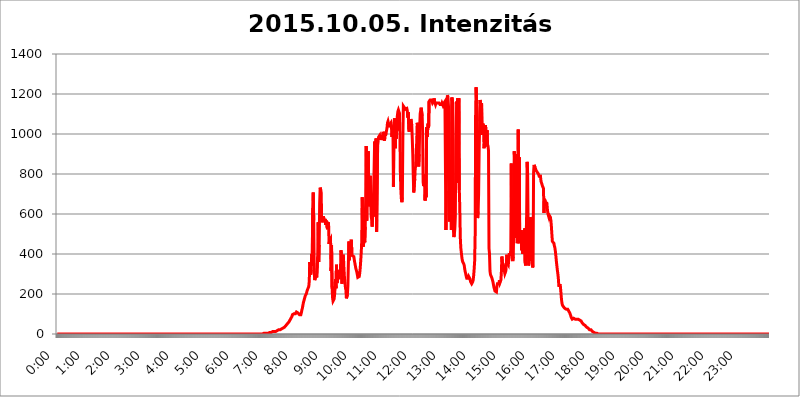
| Category | 2015.10.05. Intenzitás [W/m^2] |
|---|---|
| 0.0 | 0 |
| 0.0006944444444444445 | 0 |
| 0.001388888888888889 | 0 |
| 0.0020833333333333333 | 0 |
| 0.002777777777777778 | 0 |
| 0.003472222222222222 | 0 |
| 0.004166666666666667 | 0 |
| 0.004861111111111111 | 0 |
| 0.005555555555555556 | 0 |
| 0.0062499999999999995 | 0 |
| 0.006944444444444444 | 0 |
| 0.007638888888888889 | 0 |
| 0.008333333333333333 | 0 |
| 0.009027777777777779 | 0 |
| 0.009722222222222222 | 0 |
| 0.010416666666666666 | 0 |
| 0.011111111111111112 | 0 |
| 0.011805555555555555 | 0 |
| 0.012499999999999999 | 0 |
| 0.013194444444444444 | 0 |
| 0.013888888888888888 | 0 |
| 0.014583333333333332 | 0 |
| 0.015277777777777777 | 0 |
| 0.015972222222222224 | 0 |
| 0.016666666666666666 | 0 |
| 0.017361111111111112 | 0 |
| 0.018055555555555557 | 0 |
| 0.01875 | 0 |
| 0.019444444444444445 | 0 |
| 0.02013888888888889 | 0 |
| 0.020833333333333332 | 0 |
| 0.02152777777777778 | 0 |
| 0.022222222222222223 | 0 |
| 0.02291666666666667 | 0 |
| 0.02361111111111111 | 0 |
| 0.024305555555555556 | 0 |
| 0.024999999999999998 | 0 |
| 0.025694444444444447 | 0 |
| 0.02638888888888889 | 0 |
| 0.027083333333333334 | 0 |
| 0.027777777777777776 | 0 |
| 0.02847222222222222 | 0 |
| 0.029166666666666664 | 0 |
| 0.029861111111111113 | 0 |
| 0.030555555555555555 | 0 |
| 0.03125 | 0 |
| 0.03194444444444445 | 0 |
| 0.03263888888888889 | 0 |
| 0.03333333333333333 | 0 |
| 0.034027777777777775 | 0 |
| 0.034722222222222224 | 0 |
| 0.035416666666666666 | 0 |
| 0.036111111111111115 | 0 |
| 0.03680555555555556 | 0 |
| 0.0375 | 0 |
| 0.03819444444444444 | 0 |
| 0.03888888888888889 | 0 |
| 0.03958333333333333 | 0 |
| 0.04027777777777778 | 0 |
| 0.04097222222222222 | 0 |
| 0.041666666666666664 | 0 |
| 0.042361111111111106 | 0 |
| 0.04305555555555556 | 0 |
| 0.043750000000000004 | 0 |
| 0.044444444444444446 | 0 |
| 0.04513888888888889 | 0 |
| 0.04583333333333334 | 0 |
| 0.04652777777777778 | 0 |
| 0.04722222222222222 | 0 |
| 0.04791666666666666 | 0 |
| 0.04861111111111111 | 0 |
| 0.049305555555555554 | 0 |
| 0.049999999999999996 | 0 |
| 0.05069444444444445 | 0 |
| 0.051388888888888894 | 0 |
| 0.052083333333333336 | 0 |
| 0.05277777777777778 | 0 |
| 0.05347222222222222 | 0 |
| 0.05416666666666667 | 0 |
| 0.05486111111111111 | 0 |
| 0.05555555555555555 | 0 |
| 0.05625 | 0 |
| 0.05694444444444444 | 0 |
| 0.057638888888888885 | 0 |
| 0.05833333333333333 | 0 |
| 0.05902777777777778 | 0 |
| 0.059722222222222225 | 0 |
| 0.06041666666666667 | 0 |
| 0.061111111111111116 | 0 |
| 0.06180555555555556 | 0 |
| 0.0625 | 0 |
| 0.06319444444444444 | 0 |
| 0.06388888888888888 | 0 |
| 0.06458333333333334 | 0 |
| 0.06527777777777778 | 0 |
| 0.06597222222222222 | 0 |
| 0.06666666666666667 | 0 |
| 0.06736111111111111 | 0 |
| 0.06805555555555555 | 0 |
| 0.06874999999999999 | 0 |
| 0.06944444444444443 | 0 |
| 0.07013888888888889 | 0 |
| 0.07083333333333333 | 0 |
| 0.07152777777777779 | 0 |
| 0.07222222222222223 | 0 |
| 0.07291666666666667 | 0 |
| 0.07361111111111111 | 0 |
| 0.07430555555555556 | 0 |
| 0.075 | 0 |
| 0.07569444444444444 | 0 |
| 0.0763888888888889 | 0 |
| 0.07708333333333334 | 0 |
| 0.07777777777777778 | 0 |
| 0.07847222222222222 | 0 |
| 0.07916666666666666 | 0 |
| 0.0798611111111111 | 0 |
| 0.08055555555555556 | 0 |
| 0.08125 | 0 |
| 0.08194444444444444 | 0 |
| 0.08263888888888889 | 0 |
| 0.08333333333333333 | 0 |
| 0.08402777777777777 | 0 |
| 0.08472222222222221 | 0 |
| 0.08541666666666665 | 0 |
| 0.08611111111111112 | 0 |
| 0.08680555555555557 | 0 |
| 0.08750000000000001 | 0 |
| 0.08819444444444445 | 0 |
| 0.08888888888888889 | 0 |
| 0.08958333333333333 | 0 |
| 0.09027777777777778 | 0 |
| 0.09097222222222222 | 0 |
| 0.09166666666666667 | 0 |
| 0.09236111111111112 | 0 |
| 0.09305555555555556 | 0 |
| 0.09375 | 0 |
| 0.09444444444444444 | 0 |
| 0.09513888888888888 | 0 |
| 0.09583333333333333 | 0 |
| 0.09652777777777777 | 0 |
| 0.09722222222222222 | 0 |
| 0.09791666666666667 | 0 |
| 0.09861111111111111 | 0 |
| 0.09930555555555555 | 0 |
| 0.09999999999999999 | 0 |
| 0.10069444444444443 | 0 |
| 0.1013888888888889 | 0 |
| 0.10208333333333335 | 0 |
| 0.10277777777777779 | 0 |
| 0.10347222222222223 | 0 |
| 0.10416666666666667 | 0 |
| 0.10486111111111111 | 0 |
| 0.10555555555555556 | 0 |
| 0.10625 | 0 |
| 0.10694444444444444 | 0 |
| 0.1076388888888889 | 0 |
| 0.10833333333333334 | 0 |
| 0.10902777777777778 | 0 |
| 0.10972222222222222 | 0 |
| 0.1111111111111111 | 0 |
| 0.11180555555555556 | 0 |
| 0.11180555555555556 | 0 |
| 0.1125 | 0 |
| 0.11319444444444444 | 0 |
| 0.11388888888888889 | 0 |
| 0.11458333333333333 | 0 |
| 0.11527777777777777 | 0 |
| 0.11597222222222221 | 0 |
| 0.11666666666666665 | 0 |
| 0.1173611111111111 | 0 |
| 0.11805555555555557 | 0 |
| 0.11944444444444445 | 0 |
| 0.12013888888888889 | 0 |
| 0.12083333333333333 | 0 |
| 0.12152777777777778 | 0 |
| 0.12222222222222223 | 0 |
| 0.12291666666666667 | 0 |
| 0.12291666666666667 | 0 |
| 0.12361111111111112 | 0 |
| 0.12430555555555556 | 0 |
| 0.125 | 0 |
| 0.12569444444444444 | 0 |
| 0.12638888888888888 | 0 |
| 0.12708333333333333 | 0 |
| 0.16875 | 0 |
| 0.12847222222222224 | 0 |
| 0.12916666666666668 | 0 |
| 0.12986111111111112 | 0 |
| 0.13055555555555556 | 0 |
| 0.13125 | 0 |
| 0.13194444444444445 | 0 |
| 0.1326388888888889 | 0 |
| 0.13333333333333333 | 0 |
| 0.13402777777777777 | 0 |
| 0.13402777777777777 | 0 |
| 0.13472222222222222 | 0 |
| 0.13541666666666666 | 0 |
| 0.1361111111111111 | 0 |
| 0.13749999999999998 | 0 |
| 0.13819444444444443 | 0 |
| 0.1388888888888889 | 0 |
| 0.13958333333333334 | 0 |
| 0.14027777777777778 | 0 |
| 0.14097222222222222 | 0 |
| 0.14166666666666666 | 0 |
| 0.1423611111111111 | 0 |
| 0.14305555555555557 | 0 |
| 0.14375000000000002 | 0 |
| 0.14444444444444446 | 0 |
| 0.1451388888888889 | 0 |
| 0.1451388888888889 | 0 |
| 0.14652777777777778 | 0 |
| 0.14722222222222223 | 0 |
| 0.14791666666666667 | 0 |
| 0.1486111111111111 | 0 |
| 0.14930555555555555 | 0 |
| 0.15 | 0 |
| 0.15069444444444444 | 0 |
| 0.15138888888888888 | 0 |
| 0.15208333333333332 | 0 |
| 0.15277777777777776 | 0 |
| 0.15347222222222223 | 0 |
| 0.15416666666666667 | 0 |
| 0.15486111111111112 | 0 |
| 0.15555555555555556 | 0 |
| 0.15625 | 0 |
| 0.15694444444444444 | 0 |
| 0.15763888888888888 | 0 |
| 0.15833333333333333 | 0 |
| 0.15902777777777777 | 0 |
| 0.15972222222222224 | 0 |
| 0.16041666666666668 | 0 |
| 0.16111111111111112 | 0 |
| 0.16180555555555556 | 0 |
| 0.1625 | 0 |
| 0.16319444444444445 | 0 |
| 0.1638888888888889 | 0 |
| 0.16458333333333333 | 0 |
| 0.16527777777777777 | 0 |
| 0.16597222222222222 | 0 |
| 0.16666666666666666 | 0 |
| 0.1673611111111111 | 0 |
| 0.16805555555555554 | 0 |
| 0.16874999999999998 | 0 |
| 0.16944444444444443 | 0 |
| 0.17013888888888887 | 0 |
| 0.1708333333333333 | 0 |
| 0.17152777777777775 | 0 |
| 0.17222222222222225 | 0 |
| 0.1729166666666667 | 0 |
| 0.17361111111111113 | 0 |
| 0.17430555555555557 | 0 |
| 0.17500000000000002 | 0 |
| 0.17569444444444446 | 0 |
| 0.1763888888888889 | 0 |
| 0.17708333333333334 | 0 |
| 0.17777777777777778 | 0 |
| 0.17847222222222223 | 0 |
| 0.17916666666666667 | 0 |
| 0.1798611111111111 | 0 |
| 0.18055555555555555 | 0 |
| 0.18125 | 0 |
| 0.18194444444444444 | 0 |
| 0.1826388888888889 | 0 |
| 0.18333333333333335 | 0 |
| 0.1840277777777778 | 0 |
| 0.18472222222222223 | 0 |
| 0.18541666666666667 | 0 |
| 0.18611111111111112 | 0 |
| 0.18680555555555556 | 0 |
| 0.1875 | 0 |
| 0.18819444444444444 | 0 |
| 0.18888888888888888 | 0 |
| 0.18958333333333333 | 0 |
| 0.19027777777777777 | 0 |
| 0.1909722222222222 | 0 |
| 0.19166666666666665 | 0 |
| 0.19236111111111112 | 0 |
| 0.19305555555555554 | 0 |
| 0.19375 | 0 |
| 0.19444444444444445 | 0 |
| 0.1951388888888889 | 0 |
| 0.19583333333333333 | 0 |
| 0.19652777777777777 | 0 |
| 0.19722222222222222 | 0 |
| 0.19791666666666666 | 0 |
| 0.1986111111111111 | 0 |
| 0.19930555555555554 | 0 |
| 0.19999999999999998 | 0 |
| 0.20069444444444443 | 0 |
| 0.20138888888888887 | 0 |
| 0.2020833333333333 | 0 |
| 0.2027777777777778 | 0 |
| 0.2034722222222222 | 0 |
| 0.2041666666666667 | 0 |
| 0.20486111111111113 | 0 |
| 0.20555555555555557 | 0 |
| 0.20625000000000002 | 0 |
| 0.20694444444444446 | 0 |
| 0.2076388888888889 | 0 |
| 0.20833333333333334 | 0 |
| 0.20902777777777778 | 0 |
| 0.20972222222222223 | 0 |
| 0.21041666666666667 | 0 |
| 0.2111111111111111 | 0 |
| 0.21180555555555555 | 0 |
| 0.2125 | 0 |
| 0.21319444444444444 | 0 |
| 0.2138888888888889 | 0 |
| 0.21458333333333335 | 0 |
| 0.2152777777777778 | 0 |
| 0.21597222222222223 | 0 |
| 0.21666666666666667 | 0 |
| 0.21736111111111112 | 0 |
| 0.21805555555555556 | 0 |
| 0.21875 | 0 |
| 0.21944444444444444 | 0 |
| 0.22013888888888888 | 0 |
| 0.22083333333333333 | 0 |
| 0.22152777777777777 | 0 |
| 0.2222222222222222 | 0 |
| 0.22291666666666665 | 0 |
| 0.2236111111111111 | 0 |
| 0.22430555555555556 | 0 |
| 0.225 | 0 |
| 0.22569444444444445 | 0 |
| 0.2263888888888889 | 0 |
| 0.22708333333333333 | 0 |
| 0.22777777777777777 | 0 |
| 0.22847222222222222 | 0 |
| 0.22916666666666666 | 0 |
| 0.2298611111111111 | 0 |
| 0.23055555555555554 | 0 |
| 0.23124999999999998 | 0 |
| 0.23194444444444443 | 0 |
| 0.23263888888888887 | 0 |
| 0.2333333333333333 | 0 |
| 0.2340277777777778 | 0 |
| 0.2347222222222222 | 0 |
| 0.2354166666666667 | 0 |
| 0.23611111111111113 | 0 |
| 0.23680555555555557 | 0 |
| 0.23750000000000002 | 0 |
| 0.23819444444444446 | 0 |
| 0.2388888888888889 | 0 |
| 0.23958333333333334 | 0 |
| 0.24027777777777778 | 0 |
| 0.24097222222222223 | 0 |
| 0.24166666666666667 | 0 |
| 0.2423611111111111 | 0 |
| 0.24305555555555555 | 0 |
| 0.24375 | 0 |
| 0.24444444444444446 | 0 |
| 0.24513888888888888 | 0 |
| 0.24583333333333335 | 0 |
| 0.2465277777777778 | 0 |
| 0.24722222222222223 | 0 |
| 0.24791666666666667 | 0 |
| 0.24861111111111112 | 0 |
| 0.24930555555555556 | 0 |
| 0.25 | 0 |
| 0.25069444444444444 | 0 |
| 0.2513888888888889 | 0 |
| 0.2520833333333333 | 0 |
| 0.25277777777777777 | 0 |
| 0.2534722222222222 | 0 |
| 0.25416666666666665 | 0 |
| 0.2548611111111111 | 0 |
| 0.2555555555555556 | 0 |
| 0.25625000000000003 | 0 |
| 0.2569444444444445 | 0 |
| 0.2576388888888889 | 0 |
| 0.25833333333333336 | 0 |
| 0.2590277777777778 | 0 |
| 0.25972222222222224 | 0 |
| 0.2604166666666667 | 0 |
| 0.2611111111111111 | 0 |
| 0.26180555555555557 | 0 |
| 0.2625 | 0 |
| 0.26319444444444445 | 0 |
| 0.2638888888888889 | 0 |
| 0.26458333333333334 | 0 |
| 0.2652777777777778 | 0 |
| 0.2659722222222222 | 0 |
| 0.26666666666666666 | 0 |
| 0.2673611111111111 | 0 |
| 0.26805555555555555 | 0 |
| 0.26875 | 0 |
| 0.26944444444444443 | 0 |
| 0.2701388888888889 | 0 |
| 0.2708333333333333 | 0 |
| 0.27152777777777776 | 0 |
| 0.2722222222222222 | 0 |
| 0.27291666666666664 | 0 |
| 0.2736111111111111 | 0 |
| 0.2743055555555555 | 0 |
| 0.27499999999999997 | 0 |
| 0.27569444444444446 | 0 |
| 0.27638888888888885 | 0 |
| 0.27708333333333335 | 0 |
| 0.2777777777777778 | 0 |
| 0.27847222222222223 | 0 |
| 0.2791666666666667 | 0 |
| 0.2798611111111111 | 0 |
| 0.28055555555555556 | 0 |
| 0.28125 | 0 |
| 0.28194444444444444 | 0 |
| 0.2826388888888889 | 0 |
| 0.2833333333333333 | 0 |
| 0.28402777777777777 | 0 |
| 0.2847222222222222 | 0 |
| 0.28541666666666665 | 0 |
| 0.28611111111111115 | 0 |
| 0.28680555555555554 | 0 |
| 0.28750000000000003 | 0 |
| 0.2881944444444445 | 0 |
| 0.2888888888888889 | 0 |
| 0.28958333333333336 | 3.525 |
| 0.2902777777777778 | 3.525 |
| 0.29097222222222224 | 3.525 |
| 0.2916666666666667 | 3.525 |
| 0.2923611111111111 | 3.525 |
| 0.29305555555555557 | 3.525 |
| 0.29375 | 3.525 |
| 0.29444444444444445 | 3.525 |
| 0.2951388888888889 | 3.525 |
| 0.29583333333333334 | 3.525 |
| 0.2965277777777778 | 3.525 |
| 0.2972222222222222 | 7.887 |
| 0.29791666666666666 | 7.887 |
| 0.2986111111111111 | 7.887 |
| 0.29930555555555555 | 7.887 |
| 0.3 | 7.887 |
| 0.30069444444444443 | 7.887 |
| 0.3013888888888889 | 12.257 |
| 0.3020833333333333 | 12.257 |
| 0.30277777777777776 | 12.257 |
| 0.3034722222222222 | 12.257 |
| 0.30416666666666664 | 12.257 |
| 0.3048611111111111 | 12.257 |
| 0.3055555555555555 | 12.257 |
| 0.30624999999999997 | 12.257 |
| 0.3069444444444444 | 16.636 |
| 0.3076388888888889 | 16.636 |
| 0.30833333333333335 | 16.636 |
| 0.3090277777777778 | 21.024 |
| 0.30972222222222223 | 21.024 |
| 0.3104166666666667 | 21.024 |
| 0.3111111111111111 | 21.024 |
| 0.31180555555555556 | 21.024 |
| 0.3125 | 21.024 |
| 0.31319444444444444 | 21.024 |
| 0.3138888888888889 | 21.024 |
| 0.3145833333333333 | 25.419 |
| 0.31527777777777777 | 25.419 |
| 0.3159722222222222 | 25.419 |
| 0.31666666666666665 | 29.823 |
| 0.31736111111111115 | 29.823 |
| 0.31805555555555554 | 29.823 |
| 0.31875000000000003 | 34.234 |
| 0.3194444444444445 | 38.653 |
| 0.3201388888888889 | 38.653 |
| 0.32083333333333336 | 43.079 |
| 0.3215277777777778 | 47.511 |
| 0.32222222222222224 | 47.511 |
| 0.3229166666666667 | 51.951 |
| 0.3236111111111111 | 56.398 |
| 0.32430555555555557 | 56.398 |
| 0.325 | 60.85 |
| 0.32569444444444445 | 65.31 |
| 0.3263888888888889 | 69.775 |
| 0.32708333333333334 | 74.246 |
| 0.3277777777777778 | 78.722 |
| 0.3284722222222222 | 83.205 |
| 0.32916666666666666 | 87.692 |
| 0.3298611111111111 | 96.682 |
| 0.33055555555555555 | 101.184 |
| 0.33125 | 101.184 |
| 0.33194444444444443 | 101.184 |
| 0.3326388888888889 | 101.184 |
| 0.3333333333333333 | 101.184 |
| 0.3340277777777778 | 101.184 |
| 0.3347222222222222 | 105.69 |
| 0.3354166666666667 | 110.201 |
| 0.3361111111111111 | 110.201 |
| 0.3368055555555556 | 110.201 |
| 0.33749999999999997 | 105.69 |
| 0.33819444444444446 | 105.69 |
| 0.33888888888888885 | 101.184 |
| 0.33958333333333335 | 96.682 |
| 0.34027777777777773 | 92.184 |
| 0.34097222222222223 | 92.184 |
| 0.3416666666666666 | 96.682 |
| 0.3423611111111111 | 105.69 |
| 0.3430555555555555 | 119.235 |
| 0.34375 | 128.284 |
| 0.3444444444444445 | 141.884 |
| 0.3451388888888889 | 155.509 |
| 0.3458333333333334 | 164.605 |
| 0.34652777777777777 | 173.709 |
| 0.34722222222222227 | 182.82 |
| 0.34791666666666665 | 191.937 |
| 0.34861111111111115 | 196.497 |
| 0.34930555555555554 | 201.058 |
| 0.35000000000000003 | 210.182 |
| 0.3506944444444444 | 219.309 |
| 0.3513888888888889 | 219.309 |
| 0.3520833333333333 | 223.873 |
| 0.3527777777777778 | 237.564 |
| 0.3534722222222222 | 264.932 |
| 0.3541666666666667 | 360.221 |
| 0.3548611111111111 | 305.898 |
| 0.35555555555555557 | 296.808 |
| 0.35625 | 319.517 |
| 0.35694444444444445 | 400.638 |
| 0.3576388888888889 | 360.221 |
| 0.35833333333333334 | 629.948 |
| 0.3590277777777778 | 707.8 |
| 0.3597222222222222 | 566.793 |
| 0.36041666666666666 | 310.44 |
| 0.3611111111111111 | 269.49 |
| 0.36180555555555555 | 274.047 |
| 0.3625 | 274.047 |
| 0.36319444444444443 | 296.808 |
| 0.3638888888888889 | 283.156 |
| 0.3645833333333333 | 283.156 |
| 0.3652777777777778 | 387.202 |
| 0.3659722222222222 | 558.261 |
| 0.3666666666666667 | 360.221 |
| 0.3673611111111111 | 445.129 |
| 0.3680555555555556 | 654.791 |
| 0.36874999999999997 | 731.896 |
| 0.36944444444444446 | 723.889 |
| 0.37013888888888885 | 707.8 |
| 0.37083333333333335 | 583.779 |
| 0.37152777777777773 | 558.261 |
| 0.37222222222222223 | 571.049 |
| 0.3729166666666666 | 588.009 |
| 0.3736111111111111 | 588.009 |
| 0.3743055555555555 | 575.299 |
| 0.375 | 562.53 |
| 0.3756944444444445 | 575.299 |
| 0.3763888888888889 | 545.416 |
| 0.3770833333333334 | 541.121 |
| 0.37777777777777777 | 566.793 |
| 0.37847222222222227 | 532.513 |
| 0.37916666666666665 | 523.88 |
| 0.37986111111111115 | 558.261 |
| 0.38055555555555554 | 549.704 |
| 0.38125000000000003 | 449.551 |
| 0.3819444444444444 | 467.187 |
| 0.3826388888888889 | 467.187 |
| 0.3833333333333333 | 475.972 |
| 0.3840277777777778 | 314.98 |
| 0.3847222222222222 | 445.129 |
| 0.3854166666666667 | 233 |
| 0.3861111111111111 | 182.82 |
| 0.38680555555555557 | 164.605 |
| 0.3875 | 169.156 |
| 0.38819444444444445 | 173.709 |
| 0.3888888888888889 | 191.937 |
| 0.38958333333333334 | 228.436 |
| 0.3902777777777778 | 274.047 |
| 0.3909722222222222 | 228.436 |
| 0.39166666666666666 | 346.682 |
| 0.3923611111111111 | 255.813 |
| 0.39305555555555555 | 264.932 |
| 0.39375 | 319.517 |
| 0.39444444444444443 | 292.259 |
| 0.3951388888888889 | 274.047 |
| 0.3958333333333333 | 310.44 |
| 0.3965277777777778 | 310.44 |
| 0.3972222222222222 | 319.517 |
| 0.3979166666666667 | 418.492 |
| 0.3986111111111111 | 391.685 |
| 0.3993055555555556 | 251.251 |
| 0.39999999999999997 | 314.98 |
| 0.40069444444444446 | 396.164 |
| 0.40138888888888885 | 387.202 |
| 0.40208333333333335 | 328.584 |
| 0.40277777777777773 | 283.156 |
| 0.40347222222222223 | 255.813 |
| 0.4041666666666666 | 233 |
| 0.4048611111111111 | 219.309 |
| 0.4055555555555555 | 178.264 |
| 0.40625 | 178.264 |
| 0.4069444444444445 | 196.497 |
| 0.4076388888888889 | 242.127 |
| 0.4083333333333334 | 355.712 |
| 0.40902777777777777 | 462.786 |
| 0.40972222222222227 | 369.23 |
| 0.41041666666666665 | 414.035 |
| 0.41111111111111115 | 431.833 |
| 0.41180555555555554 | 418.492 |
| 0.41250000000000003 | 471.582 |
| 0.4131944444444444 | 400.638 |
| 0.4138888888888889 | 391.685 |
| 0.4145833333333333 | 391.685 |
| 0.4152777777777778 | 391.685 |
| 0.4159722222222222 | 387.202 |
| 0.4166666666666667 | 369.23 |
| 0.4173611111111111 | 355.712 |
| 0.41805555555555557 | 342.162 |
| 0.41875 | 328.584 |
| 0.41944444444444445 | 319.517 |
| 0.4201388888888889 | 310.44 |
| 0.42083333333333334 | 314.98 |
| 0.4215277777777778 | 283.156 |
| 0.4222222222222222 | 278.603 |
| 0.42291666666666666 | 278.603 |
| 0.4236111111111111 | 287.709 |
| 0.42430555555555555 | 305.898 |
| 0.425 | 333.113 |
| 0.42569444444444443 | 369.23 |
| 0.4263888888888889 | 409.574 |
| 0.4270833333333333 | 467.187 |
| 0.4277777777777778 | 683.473 |
| 0.4284722222222222 | 453.968 |
| 0.4291666666666667 | 436.27 |
| 0.4298611111111111 | 436.27 |
| 0.4305555555555556 | 480.356 |
| 0.43124999999999997 | 458.38 |
| 0.43194444444444446 | 536.82 |
| 0.43263888888888885 | 695.666 |
| 0.43333333333333335 | 940.082 |
| 0.43402777777777773 | 566.793 |
| 0.43472222222222223 | 798.974 |
| 0.4354166666666666 | 671.22 |
| 0.4361111111111111 | 913.766 |
| 0.4368055555555555 | 699.717 |
| 0.4375 | 638.256 |
| 0.4381944444444445 | 671.22 |
| 0.4388888888888889 | 791.169 |
| 0.4395833333333334 | 675.311 |
| 0.44027777777777777 | 588.009 |
| 0.44097222222222227 | 571.049 |
| 0.44166666666666665 | 536.82 |
| 0.44236111111111115 | 532.513 |
| 0.44305555555555554 | 638.256 |
| 0.44375000000000003 | 723.889 |
| 0.4444444444444444 | 829.981 |
| 0.4451388888888889 | 962.555 |
| 0.4458333333333333 | 936.33 |
| 0.4465277777777778 | 588.009 |
| 0.4472222222222222 | 977.508 |
| 0.4479166666666667 | 510.885 |
| 0.4486111111111111 | 506.542 |
| 0.44930555555555557 | 940.082 |
| 0.45 | 936.33 |
| 0.45069444444444445 | 984.98 |
| 0.4513888888888889 | 988.714 |
| 0.45208333333333334 | 992.448 |
| 0.4527777777777778 | 970.034 |
| 0.4534722222222222 | 981.244 |
| 0.45416666666666666 | 981.244 |
| 0.4548611111111111 | 981.244 |
| 0.45555555555555555 | 977.508 |
| 0.45625 | 992.448 |
| 0.45694444444444443 | 1011.118 |
| 0.4576388888888889 | 1003.65 |
| 0.4583333333333333 | 981.244 |
| 0.4590277777777778 | 966.295 |
| 0.4597222222222222 | 1003.65 |
| 0.4604166666666667 | 992.448 |
| 0.4611111111111111 | 1003.65 |
| 0.4618055555555556 | 1007.383 |
| 0.46249999999999997 | 1029.798 |
| 0.46319444444444446 | 1056.004 |
| 0.46388888888888885 | 1063.51 |
| 0.46458333333333335 | 1059.756 |
| 0.46527777777777773 | 1041.019 |
| 0.46597222222222223 | 1033.537 |
| 0.4666666666666666 | 1048.508 |
| 0.4673611111111111 | 1044.762 |
| 0.4680555555555555 | 1056.004 |
| 0.46875 | 1041.019 |
| 0.4694444444444445 | 984.98 |
| 0.4701388888888889 | 1037.277 |
| 0.4708333333333334 | 1022.323 |
| 0.47152777777777777 | 735.89 |
| 0.47222222222222227 | 1041.019 |
| 0.47291666666666665 | 1078.555 |
| 0.47361111111111115 | 1044.762 |
| 0.47430555555555554 | 928.819 |
| 0.47500000000000003 | 1063.51 |
| 0.4756944444444444 | 977.508 |
| 0.4763888888888889 | 1067.267 |
| 0.4770833333333333 | 1093.653 |
| 0.4777777777777778 | 1112.618 |
| 0.4784722222222222 | 1120.238 |
| 0.4791666666666667 | 1112.618 |
| 0.4798611111111111 | 1105.019 |
| 0.48055555555555557 | 1011.118 |
| 0.48125 | 806.757 |
| 0.48194444444444445 | 719.877 |
| 0.4826388888888889 | 675.311 |
| 0.48333333333333334 | 658.909 |
| 0.4840277777777778 | 683.473 |
| 0.4847222222222222 | 981.244 |
| 0.48541666666666666 | 1139.384 |
| 0.4861111111111111 | 1143.232 |
| 0.48680555555555555 | 1131.708 |
| 0.4875 | 1127.879 |
| 0.48819444444444443 | 1124.056 |
| 0.4888888888888889 | 1127.879 |
| 0.4895833333333333 | 1124.056 |
| 0.4902777777777778 | 1127.879 |
| 0.4909722222222222 | 1116.426 |
| 0.4916666666666667 | 1082.324 |
| 0.4923611111111111 | 1108.816 |
| 0.4930555555555556 | 1022.323 |
| 0.49374999999999997 | 1011.118 |
| 0.49444444444444446 | 1059.756 |
| 0.49513888888888885 | 1022.323 |
| 0.49583333333333335 | 1074.789 |
| 0.49652777777777773 | 1071.027 |
| 0.49722222222222223 | 1044.762 |
| 0.4979166666666666 | 977.508 |
| 0.4986111111111111 | 902.447 |
| 0.4993055555555555 | 795.074 |
| 0.5 | 707.8 |
| 0.5006944444444444 | 703.762 |
| 0.5013888888888889 | 775.492 |
| 0.5020833333333333 | 829.981 |
| 0.5027777777777778 | 837.682 |
| 0.5034722222222222 | 913.766 |
| 0.5041666666666667 | 958.814 |
| 0.5048611111111111 | 1056.004 |
| 0.5055555555555555 | 1041.019 |
| 0.50625 | 955.071 |
| 0.5069444444444444 | 837.682 |
| 0.5076388888888889 | 898.668 |
| 0.5083333333333333 | 1033.537 |
| 0.5090277777777777 | 1101.226 |
| 0.5097222222222222 | 1116.426 |
| 0.5104166666666666 | 1131.708 |
| 0.5111111111111112 | 1127.879 |
| 0.5118055555555555 | 1089.873 |
| 0.5125000000000001 | 1011.118 |
| 0.5131944444444444 | 759.723 |
| 0.513888888888889 | 739.877 |
| 0.5145833333333333 | 779.42 |
| 0.5152777777777778 | 798.974 |
| 0.5159722222222222 | 667.123 |
| 0.5166666666666667 | 727.896 |
| 0.517361111111111 | 683.473 |
| 0.5180555555555556 | 1033.537 |
| 0.5187499999999999 | 984.98 |
| 0.5194444444444445 | 984.98 |
| 0.5201388888888888 | 1052.255 |
| 0.5208333333333334 | 1029.798 |
| 0.5215277777777778 | 1162.571 |
| 0.5222222222222223 | 1166.46 |
| 0.5229166666666667 | 1170.358 |
| 0.5236111111111111 | 1170.358 |
| 0.5243055555555556 | 1170.358 |
| 0.525 | 1170.358 |
| 0.5256944444444445 | 1162.571 |
| 0.5263888888888889 | 1154.814 |
| 0.5270833333333333 | 1150.946 |
| 0.5277777777777778 | 1162.571 |
| 0.5284722222222222 | 1178.177 |
| 0.5291666666666667 | 1166.46 |
| 0.5298611111111111 | 1154.814 |
| 0.5305555555555556 | 1147.086 |
| 0.53125 | 1154.814 |
| 0.5319444444444444 | 1150.946 |
| 0.5326388888888889 | 1154.814 |
| 0.5333333333333333 | 1154.814 |
| 0.5340277777777778 | 1158.689 |
| 0.5347222222222222 | 1154.814 |
| 0.5354166666666667 | 1154.814 |
| 0.5361111111111111 | 1150.946 |
| 0.5368055555555555 | 1147.086 |
| 0.5375 | 1147.086 |
| 0.5381944444444444 | 1147.086 |
| 0.5388888888888889 | 1147.086 |
| 0.5395833333333333 | 1154.814 |
| 0.5402777777777777 | 1154.814 |
| 0.5409722222222222 | 1143.232 |
| 0.5416666666666666 | 1147.086 |
| 0.5423611111111112 | 1154.814 |
| 0.5430555555555555 | 1150.946 |
| 0.5437500000000001 | 1162.571 |
| 0.5444444444444444 | 1162.571 |
| 0.545138888888889 | 519.555 |
| 0.5458333333333333 | 715.858 |
| 0.5465277777777778 | 1131.708 |
| 0.5472222222222222 | 1193.918 |
| 0.5479166666666667 | 1186.03 |
| 0.548611111111111 | 1182.099 |
| 0.5493055555555556 | 1105.019 |
| 0.5499999999999999 | 562.53 |
| 0.5506944444444445 | 600.661 |
| 0.5513888888888888 | 872.114 |
| 0.5520833333333334 | 856.855 |
| 0.5527777777777778 | 519.555 |
| 0.5534722222222223 | 1182.099 |
| 0.5541666666666667 | 1186.03 |
| 0.5548611111111111 | 1150.946 |
| 0.5555555555555556 | 523.88 |
| 0.55625 | 484.735 |
| 0.5569444444444445 | 497.836 |
| 0.5576388888888889 | 528.2 |
| 0.5583333333333333 | 588.009 |
| 0.5590277777777778 | 970.034 |
| 0.5597222222222222 | 1086.097 |
| 0.5604166666666667 | 1162.571 |
| 0.5611111111111111 | 1052.255 |
| 0.5618055555555556 | 1178.177 |
| 0.5625 | 755.766 |
| 0.5631944444444444 | 1178.177 |
| 0.5638888888888889 | 719.877 |
| 0.5645833333333333 | 629.948 |
| 0.5652777777777778 | 484.735 |
| 0.5659722222222222 | 431.833 |
| 0.5666666666666667 | 409.574 |
| 0.5673611111111111 | 387.202 |
| 0.5680555555555555 | 369.23 |
| 0.56875 | 360.221 |
| 0.5694444444444444 | 360.221 |
| 0.5701388888888889 | 351.198 |
| 0.5708333333333333 | 342.162 |
| 0.5715277777777777 | 324.052 |
| 0.5722222222222222 | 310.44 |
| 0.5729166666666666 | 301.354 |
| 0.5736111111111112 | 287.709 |
| 0.5743055555555555 | 278.603 |
| 0.5750000000000001 | 274.047 |
| 0.5756944444444444 | 278.603 |
| 0.576388888888889 | 278.603 |
| 0.5770833333333333 | 287.709 |
| 0.5777777777777778 | 287.709 |
| 0.5784722222222222 | 278.603 |
| 0.5791666666666667 | 274.047 |
| 0.579861111111111 | 260.373 |
| 0.5805555555555556 | 255.813 |
| 0.5812499999999999 | 251.251 |
| 0.5819444444444445 | 251.251 |
| 0.5826388888888888 | 260.373 |
| 0.5833333333333334 | 269.49 |
| 0.5840277777777778 | 292.259 |
| 0.5847222222222223 | 324.052 |
| 0.5854166666666667 | 364.728 |
| 0.5861111111111111 | 493.475 |
| 0.5868055555555556 | 1105.019 |
| 0.5875 | 1233.951 |
| 0.5881944444444445 | 1233.951 |
| 0.5888888888888889 | 1063.51 |
| 0.5895833333333333 | 579.542 |
| 0.5902777777777778 | 613.252 |
| 0.5909722222222222 | 699.717 |
| 0.5916666666666667 | 906.223 |
| 0.5923611111111111 | 1037.277 |
| 0.5930555555555556 | 1170.358 |
| 0.59375 | 1174.263 |
| 0.5944444444444444 | 1105.019 |
| 0.5951388888888889 | 1154.814 |
| 0.5958333333333333 | 996.182 |
| 0.5965277777777778 | 1026.06 |
| 0.5972222222222222 | 1052.255 |
| 0.5979166666666667 | 1014.852 |
| 0.5986111111111111 | 928.819 |
| 0.5993055555555555 | 962.555 |
| 0.6 | 936.33 |
| 0.6006944444444444 | 1044.762 |
| 0.6013888888888889 | 988.714 |
| 0.6020833333333333 | 981.244 |
| 0.6027777777777777 | 1018.587 |
| 0.6034722222222222 | 947.58 |
| 0.6041666666666666 | 940.082 |
| 0.6048611111111112 | 917.534 |
| 0.6055555555555555 | 427.39 |
| 0.6062500000000001 | 400.638 |
| 0.6069444444444444 | 314.98 |
| 0.607638888888889 | 296.808 |
| 0.6083333333333333 | 296.808 |
| 0.6090277777777778 | 292.259 |
| 0.6097222222222222 | 278.603 |
| 0.6104166666666667 | 269.49 |
| 0.611111111111111 | 260.373 |
| 0.6118055555555556 | 246.689 |
| 0.6124999999999999 | 233 |
| 0.6131944444444445 | 223.873 |
| 0.6138888888888888 | 214.746 |
| 0.6145833333333334 | 210.182 |
| 0.6152777777777778 | 210.182 |
| 0.6159722222222223 | 210.182 |
| 0.6166666666666667 | 237.564 |
| 0.6173611111111111 | 251.251 |
| 0.6180555555555556 | 255.813 |
| 0.61875 | 251.251 |
| 0.6194444444444445 | 251.251 |
| 0.6201388888888889 | 269.49 |
| 0.6208333333333333 | 255.813 |
| 0.6215277777777778 | 260.373 |
| 0.6222222222222222 | 269.49 |
| 0.6229166666666667 | 310.44 |
| 0.6236111111111111 | 387.202 |
| 0.6243055555555556 | 360.221 |
| 0.625 | 351.198 |
| 0.6256944444444444 | 342.162 |
| 0.6263888888888889 | 333.113 |
| 0.6270833333333333 | 314.98 |
| 0.6277777777777778 | 301.354 |
| 0.6284722222222222 | 296.808 |
| 0.6291666666666667 | 314.98 |
| 0.6298611111111111 | 351.198 |
| 0.6305555555555555 | 396.164 |
| 0.63125 | 355.712 |
| 0.6319444444444444 | 351.198 |
| 0.6326388888888889 | 346.682 |
| 0.6333333333333333 | 373.729 |
| 0.6340277777777777 | 405.108 |
| 0.6347222222222222 | 400.638 |
| 0.6354166666666666 | 391.685 |
| 0.6361111111111112 | 414.035 |
| 0.6368055555555555 | 853.029 |
| 0.6375000000000001 | 396.164 |
| 0.6381944444444444 | 373.729 |
| 0.638888888888889 | 364.728 |
| 0.6395833333333333 | 387.202 |
| 0.6402777777777778 | 541.121 |
| 0.6409722222222222 | 913.766 |
| 0.6416666666666667 | 845.365 |
| 0.642361111111111 | 480.356 |
| 0.6430555555555556 | 898.668 |
| 0.6437499999999999 | 519.555 |
| 0.6444444444444445 | 837.682 |
| 0.6451388888888888 | 453.968 |
| 0.6458333333333334 | 462.786 |
| 0.6465277777777778 | 1022.323 |
| 0.6472222222222223 | 634.105 |
| 0.6479166666666667 | 883.516 |
| 0.6486111111111111 | 471.582 |
| 0.6493055555555556 | 453.968 |
| 0.65 | 510.885 |
| 0.6506944444444445 | 519.555 |
| 0.6513888888888889 | 418.492 |
| 0.6520833333333333 | 510.885 |
| 0.6527777777777778 | 400.638 |
| 0.6534722222222222 | 400.638 |
| 0.6541666666666667 | 422.943 |
| 0.6548611111111111 | 422.943 |
| 0.6555555555555556 | 528.2 |
| 0.65625 | 355.712 |
| 0.6569444444444444 | 342.162 |
| 0.6576388888888889 | 346.682 |
| 0.6583333333333333 | 583.779 |
| 0.6590277777777778 | 860.676 |
| 0.6597222222222222 | 802.868 |
| 0.6604166666666667 | 545.416 |
| 0.6611111111111111 | 342.162 |
| 0.6618055555555555 | 360.221 |
| 0.6625 | 369.23 |
| 0.6631944444444444 | 583.779 |
| 0.6638888888888889 | 575.299 |
| 0.6645833333333333 | 414.035 |
| 0.6652777777777777 | 364.728 |
| 0.6659722222222222 | 497.836 |
| 0.6666666666666666 | 333.113 |
| 0.6673611111111111 | 342.162 |
| 0.6680555555555556 | 806.757 |
| 0.6687500000000001 | 845.365 |
| 0.6694444444444444 | 845.365 |
| 0.6701388888888888 | 833.834 |
| 0.6708333333333334 | 833.834 |
| 0.6715277777777778 | 818.392 |
| 0.6722222222222222 | 814.519 |
| 0.6729166666666666 | 814.519 |
| 0.6736111111111112 | 806.757 |
| 0.6743055555555556 | 802.868 |
| 0.6749999999999999 | 798.974 |
| 0.6756944444444444 | 795.074 |
| 0.6763888888888889 | 783.342 |
| 0.6770833333333334 | 795.074 |
| 0.6777777777777777 | 787.258 |
| 0.6784722222222223 | 763.674 |
| 0.6791666666666667 | 759.723 |
| 0.6798611111111111 | 763.674 |
| 0.6805555555555555 | 739.877 |
| 0.68125 | 739.877 |
| 0.6819444444444445 | 727.896 |
| 0.6826388888888889 | 604.864 |
| 0.6833333333333332 | 675.311 |
| 0.6840277777777778 | 679.395 |
| 0.6847222222222222 | 658.909 |
| 0.6854166666666667 | 642.4 |
| 0.686111111111111 | 658.909 |
| 0.6868055555555556 | 650.667 |
| 0.6875 | 621.613 |
| 0.6881944444444444 | 600.661 |
| 0.688888888888889 | 596.45 |
| 0.6895833333333333 | 583.779 |
| 0.6902777777777778 | 592.233 |
| 0.6909722222222222 | 592.233 |
| 0.6916666666666668 | 583.779 |
| 0.6923611111111111 | 566.793 |
| 0.6930555555555555 | 536.82 |
| 0.69375 | 497.836 |
| 0.6944444444444445 | 462.786 |
| 0.6951388888888889 | 462.786 |
| 0.6958333333333333 | 458.38 |
| 0.6965277777777777 | 453.968 |
| 0.6972222222222223 | 440.702 |
| 0.6979166666666666 | 431.833 |
| 0.6986111111111111 | 414.035 |
| 0.6993055555555556 | 391.685 |
| 0.7000000000000001 | 364.728 |
| 0.7006944444444444 | 342.162 |
| 0.7013888888888888 | 319.517 |
| 0.7020833333333334 | 301.354 |
| 0.7027777777777778 | 278.603 |
| 0.7034722222222222 | 242.127 |
| 0.7041666666666666 | 242.127 |
| 0.7048611111111112 | 246.689 |
| 0.7055555555555556 | 242.127 |
| 0.7062499999999999 | 214.746 |
| 0.7069444444444444 | 182.82 |
| 0.7076388888888889 | 160.056 |
| 0.7083333333333334 | 146.423 |
| 0.7090277777777777 | 141.884 |
| 0.7097222222222223 | 137.347 |
| 0.7104166666666667 | 132.814 |
| 0.7111111111111111 | 132.814 |
| 0.7118055555555555 | 128.284 |
| 0.7125 | 128.284 |
| 0.7131944444444445 | 123.758 |
| 0.7138888888888889 | 123.758 |
| 0.7145833333333332 | 123.758 |
| 0.7152777777777778 | 123.758 |
| 0.7159722222222222 | 123.758 |
| 0.7166666666666667 | 119.235 |
| 0.717361111111111 | 114.716 |
| 0.7180555555555556 | 110.201 |
| 0.71875 | 105.69 |
| 0.7194444444444444 | 101.184 |
| 0.720138888888889 | 92.184 |
| 0.7208333333333333 | 83.205 |
| 0.7215277777777778 | 78.722 |
| 0.7222222222222222 | 74.246 |
| 0.7229166666666668 | 78.722 |
| 0.7236111111111111 | 78.722 |
| 0.7243055555555555 | 78.722 |
| 0.725 | 78.722 |
| 0.7256944444444445 | 78.722 |
| 0.7263888888888889 | 74.246 |
| 0.7270833333333333 | 74.246 |
| 0.7277777777777777 | 74.246 |
| 0.7284722222222223 | 74.246 |
| 0.7291666666666666 | 74.246 |
| 0.7298611111111111 | 74.246 |
| 0.7305555555555556 | 74.246 |
| 0.7312500000000001 | 74.246 |
| 0.7319444444444444 | 69.775 |
| 0.7326388888888888 | 69.775 |
| 0.7333333333333334 | 69.775 |
| 0.7340277777777778 | 65.31 |
| 0.7347222222222222 | 65.31 |
| 0.7354166666666666 | 60.85 |
| 0.7361111111111112 | 56.398 |
| 0.7368055555555556 | 56.398 |
| 0.7374999999999999 | 51.951 |
| 0.7381944444444444 | 47.511 |
| 0.7388888888888889 | 47.511 |
| 0.7395833333333334 | 47.511 |
| 0.7402777777777777 | 43.079 |
| 0.7409722222222223 | 38.653 |
| 0.7416666666666667 | 38.653 |
| 0.7423611111111111 | 34.234 |
| 0.7430555555555555 | 34.234 |
| 0.74375 | 29.823 |
| 0.7444444444444445 | 29.823 |
| 0.7451388888888889 | 29.823 |
| 0.7458333333333332 | 25.419 |
| 0.7465277777777778 | 21.024 |
| 0.7472222222222222 | 21.024 |
| 0.7479166666666667 | 21.024 |
| 0.748611111111111 | 21.024 |
| 0.7493055555555556 | 16.636 |
| 0.75 | 16.636 |
| 0.7506944444444444 | 12.257 |
| 0.751388888888889 | 12.257 |
| 0.7520833333333333 | 12.257 |
| 0.7527777777777778 | 7.887 |
| 0.7534722222222222 | 7.887 |
| 0.7541666666666668 | 3.525 |
| 0.7548611111111111 | 3.525 |
| 0.7555555555555555 | 3.525 |
| 0.75625 | 3.525 |
| 0.7569444444444445 | 3.525 |
| 0.7576388888888889 | 3.525 |
| 0.7583333333333333 | 3.525 |
| 0.7590277777777777 | 0 |
| 0.7597222222222223 | 0 |
| 0.7604166666666666 | 0 |
| 0.7611111111111111 | 0 |
| 0.7618055555555556 | 0 |
| 0.7625000000000001 | 0 |
| 0.7631944444444444 | 0 |
| 0.7638888888888888 | 0 |
| 0.7645833333333334 | 0 |
| 0.7652777777777778 | 0 |
| 0.7659722222222222 | 0 |
| 0.7666666666666666 | 0 |
| 0.7673611111111112 | 0 |
| 0.7680555555555556 | 0 |
| 0.7687499999999999 | 0 |
| 0.7694444444444444 | 0 |
| 0.7701388888888889 | 0 |
| 0.7708333333333334 | 0 |
| 0.7715277777777777 | 0 |
| 0.7722222222222223 | 0 |
| 0.7729166666666667 | 0 |
| 0.7736111111111111 | 0 |
| 0.7743055555555555 | 0 |
| 0.775 | 0 |
| 0.7756944444444445 | 0 |
| 0.7763888888888889 | 0 |
| 0.7770833333333332 | 0 |
| 0.7777777777777778 | 0 |
| 0.7784722222222222 | 0 |
| 0.7791666666666667 | 0 |
| 0.779861111111111 | 0 |
| 0.7805555555555556 | 0 |
| 0.78125 | 0 |
| 0.7819444444444444 | 0 |
| 0.782638888888889 | 0 |
| 0.7833333333333333 | 0 |
| 0.7840277777777778 | 0 |
| 0.7847222222222222 | 0 |
| 0.7854166666666668 | 0 |
| 0.7861111111111111 | 0 |
| 0.7868055555555555 | 0 |
| 0.7875 | 0 |
| 0.7881944444444445 | 0 |
| 0.7888888888888889 | 0 |
| 0.7895833333333333 | 0 |
| 0.7902777777777777 | 0 |
| 0.7909722222222223 | 0 |
| 0.7916666666666666 | 0 |
| 0.7923611111111111 | 0 |
| 0.7930555555555556 | 0 |
| 0.7937500000000001 | 0 |
| 0.7944444444444444 | 0 |
| 0.7951388888888888 | 0 |
| 0.7958333333333334 | 0 |
| 0.7965277777777778 | 0 |
| 0.7972222222222222 | 0 |
| 0.7979166666666666 | 0 |
| 0.7986111111111112 | 0 |
| 0.7993055555555556 | 0 |
| 0.7999999999999999 | 0 |
| 0.8006944444444444 | 0 |
| 0.8013888888888889 | 0 |
| 0.8020833333333334 | 0 |
| 0.8027777777777777 | 0 |
| 0.8034722222222223 | 0 |
| 0.8041666666666667 | 0 |
| 0.8048611111111111 | 0 |
| 0.8055555555555555 | 0 |
| 0.80625 | 0 |
| 0.8069444444444445 | 0 |
| 0.8076388888888889 | 0 |
| 0.8083333333333332 | 0 |
| 0.8090277777777778 | 0 |
| 0.8097222222222222 | 0 |
| 0.8104166666666667 | 0 |
| 0.811111111111111 | 0 |
| 0.8118055555555556 | 0 |
| 0.8125 | 0 |
| 0.8131944444444444 | 0 |
| 0.813888888888889 | 0 |
| 0.8145833333333333 | 0 |
| 0.8152777777777778 | 0 |
| 0.8159722222222222 | 0 |
| 0.8166666666666668 | 0 |
| 0.8173611111111111 | 0 |
| 0.8180555555555555 | 0 |
| 0.81875 | 0 |
| 0.8194444444444445 | 0 |
| 0.8201388888888889 | 0 |
| 0.8208333333333333 | 0 |
| 0.8215277777777777 | 0 |
| 0.8222222222222223 | 0 |
| 0.8229166666666666 | 0 |
| 0.8236111111111111 | 0 |
| 0.8243055555555556 | 0 |
| 0.8250000000000001 | 0 |
| 0.8256944444444444 | 0 |
| 0.8263888888888888 | 0 |
| 0.8270833333333334 | 0 |
| 0.8277777777777778 | 0 |
| 0.8284722222222222 | 0 |
| 0.8291666666666666 | 0 |
| 0.8298611111111112 | 0 |
| 0.8305555555555556 | 0 |
| 0.8312499999999999 | 0 |
| 0.8319444444444444 | 0 |
| 0.8326388888888889 | 0 |
| 0.8333333333333334 | 0 |
| 0.8340277777777777 | 0 |
| 0.8347222222222223 | 0 |
| 0.8354166666666667 | 0 |
| 0.8361111111111111 | 0 |
| 0.8368055555555555 | 0 |
| 0.8375 | 0 |
| 0.8381944444444445 | 0 |
| 0.8388888888888889 | 0 |
| 0.8395833333333332 | 0 |
| 0.8402777777777778 | 0 |
| 0.8409722222222222 | 0 |
| 0.8416666666666667 | 0 |
| 0.842361111111111 | 0 |
| 0.8430555555555556 | 0 |
| 0.84375 | 0 |
| 0.8444444444444444 | 0 |
| 0.845138888888889 | 0 |
| 0.8458333333333333 | 0 |
| 0.8465277777777778 | 0 |
| 0.8472222222222222 | 0 |
| 0.8479166666666668 | 0 |
| 0.8486111111111111 | 0 |
| 0.8493055555555555 | 0 |
| 0.85 | 0 |
| 0.8506944444444445 | 0 |
| 0.8513888888888889 | 0 |
| 0.8520833333333333 | 0 |
| 0.8527777777777777 | 0 |
| 0.8534722222222223 | 0 |
| 0.8541666666666666 | 0 |
| 0.8548611111111111 | 0 |
| 0.8555555555555556 | 0 |
| 0.8562500000000001 | 0 |
| 0.8569444444444444 | 0 |
| 0.8576388888888888 | 0 |
| 0.8583333333333334 | 0 |
| 0.8590277777777778 | 0 |
| 0.8597222222222222 | 0 |
| 0.8604166666666666 | 0 |
| 0.8611111111111112 | 0 |
| 0.8618055555555556 | 0 |
| 0.8624999999999999 | 0 |
| 0.8631944444444444 | 0 |
| 0.8638888888888889 | 0 |
| 0.8645833333333334 | 0 |
| 0.8652777777777777 | 0 |
| 0.8659722222222223 | 0 |
| 0.8666666666666667 | 0 |
| 0.8673611111111111 | 0 |
| 0.8680555555555555 | 0 |
| 0.86875 | 0 |
| 0.8694444444444445 | 0 |
| 0.8701388888888889 | 0 |
| 0.8708333333333332 | 0 |
| 0.8715277777777778 | 0 |
| 0.8722222222222222 | 0 |
| 0.8729166666666667 | 0 |
| 0.873611111111111 | 0 |
| 0.8743055555555556 | 0 |
| 0.875 | 0 |
| 0.8756944444444444 | 0 |
| 0.876388888888889 | 0 |
| 0.8770833333333333 | 0 |
| 0.8777777777777778 | 0 |
| 0.8784722222222222 | 0 |
| 0.8791666666666668 | 0 |
| 0.8798611111111111 | 0 |
| 0.8805555555555555 | 0 |
| 0.88125 | 0 |
| 0.8819444444444445 | 0 |
| 0.8826388888888889 | 0 |
| 0.8833333333333333 | 0 |
| 0.8840277777777777 | 0 |
| 0.8847222222222223 | 0 |
| 0.8854166666666666 | 0 |
| 0.8861111111111111 | 0 |
| 0.8868055555555556 | 0 |
| 0.8875000000000001 | 0 |
| 0.8881944444444444 | 0 |
| 0.8888888888888888 | 0 |
| 0.8895833333333334 | 0 |
| 0.8902777777777778 | 0 |
| 0.8909722222222222 | 0 |
| 0.8916666666666666 | 0 |
| 0.8923611111111112 | 0 |
| 0.8930555555555556 | 0 |
| 0.8937499999999999 | 0 |
| 0.8944444444444444 | 0 |
| 0.8951388888888889 | 0 |
| 0.8958333333333334 | 0 |
| 0.8965277777777777 | 0 |
| 0.8972222222222223 | 0 |
| 0.8979166666666667 | 0 |
| 0.8986111111111111 | 0 |
| 0.8993055555555555 | 0 |
| 0.9 | 0 |
| 0.9006944444444445 | 0 |
| 0.9013888888888889 | 0 |
| 0.9020833333333332 | 0 |
| 0.9027777777777778 | 0 |
| 0.9034722222222222 | 0 |
| 0.9041666666666667 | 0 |
| 0.904861111111111 | 0 |
| 0.9055555555555556 | 0 |
| 0.90625 | 0 |
| 0.9069444444444444 | 0 |
| 0.907638888888889 | 0 |
| 0.9083333333333333 | 0 |
| 0.9090277777777778 | 0 |
| 0.9097222222222222 | 0 |
| 0.9104166666666668 | 0 |
| 0.9111111111111111 | 0 |
| 0.9118055555555555 | 0 |
| 0.9125 | 0 |
| 0.9131944444444445 | 0 |
| 0.9138888888888889 | 0 |
| 0.9145833333333333 | 0 |
| 0.9152777777777777 | 0 |
| 0.9159722222222223 | 0 |
| 0.9166666666666666 | 0 |
| 0.9173611111111111 | 0 |
| 0.9180555555555556 | 0 |
| 0.9187500000000001 | 0 |
| 0.9194444444444444 | 0 |
| 0.9201388888888888 | 0 |
| 0.9208333333333334 | 0 |
| 0.9215277777777778 | 0 |
| 0.9222222222222222 | 0 |
| 0.9229166666666666 | 0 |
| 0.9236111111111112 | 0 |
| 0.9243055555555556 | 0 |
| 0.9249999999999999 | 0 |
| 0.9256944444444444 | 0 |
| 0.9263888888888889 | 0 |
| 0.9270833333333334 | 0 |
| 0.9277777777777777 | 0 |
| 0.9284722222222223 | 0 |
| 0.9291666666666667 | 0 |
| 0.9298611111111111 | 0 |
| 0.9305555555555555 | 0 |
| 0.93125 | 0 |
| 0.9319444444444445 | 0 |
| 0.9326388888888889 | 0 |
| 0.9333333333333332 | 0 |
| 0.9340277777777778 | 0 |
| 0.9347222222222222 | 0 |
| 0.9354166666666667 | 0 |
| 0.936111111111111 | 0 |
| 0.9368055555555556 | 0 |
| 0.9375 | 0 |
| 0.9381944444444444 | 0 |
| 0.938888888888889 | 0 |
| 0.9395833333333333 | 0 |
| 0.9402777777777778 | 0 |
| 0.9409722222222222 | 0 |
| 0.9416666666666668 | 0 |
| 0.9423611111111111 | 0 |
| 0.9430555555555555 | 0 |
| 0.94375 | 0 |
| 0.9444444444444445 | 0 |
| 0.9451388888888889 | 0 |
| 0.9458333333333333 | 0 |
| 0.9465277777777777 | 0 |
| 0.9472222222222223 | 0 |
| 0.9479166666666666 | 0 |
| 0.9486111111111111 | 0 |
| 0.9493055555555556 | 0 |
| 0.9500000000000001 | 0 |
| 0.9506944444444444 | 0 |
| 0.9513888888888888 | 0 |
| 0.9520833333333334 | 0 |
| 0.9527777777777778 | 0 |
| 0.9534722222222222 | 0 |
| 0.9541666666666666 | 0 |
| 0.9548611111111112 | 0 |
| 0.9555555555555556 | 0 |
| 0.9562499999999999 | 0 |
| 0.9569444444444444 | 0 |
| 0.9576388888888889 | 0 |
| 0.9583333333333334 | 0 |
| 0.9590277777777777 | 0 |
| 0.9597222222222223 | 0 |
| 0.9604166666666667 | 0 |
| 0.9611111111111111 | 0 |
| 0.9618055555555555 | 0 |
| 0.9625 | 0 |
| 0.9631944444444445 | 0 |
| 0.9638888888888889 | 0 |
| 0.9645833333333332 | 0 |
| 0.9652777777777778 | 0 |
| 0.9659722222222222 | 0 |
| 0.9666666666666667 | 0 |
| 0.967361111111111 | 0 |
| 0.9680555555555556 | 0 |
| 0.96875 | 0 |
| 0.9694444444444444 | 0 |
| 0.970138888888889 | 0 |
| 0.9708333333333333 | 0 |
| 0.9715277777777778 | 0 |
| 0.9722222222222222 | 0 |
| 0.9729166666666668 | 0 |
| 0.9736111111111111 | 0 |
| 0.9743055555555555 | 0 |
| 0.975 | 0 |
| 0.9756944444444445 | 0 |
| 0.9763888888888889 | 0 |
| 0.9770833333333333 | 0 |
| 0.9777777777777777 | 0 |
| 0.9784722222222223 | 0 |
| 0.9791666666666666 | 0 |
| 0.9798611111111111 | 0 |
| 0.9805555555555556 | 0 |
| 0.9812500000000001 | 0 |
| 0.9819444444444444 | 0 |
| 0.9826388888888888 | 0 |
| 0.9833333333333334 | 0 |
| 0.9840277777777778 | 0 |
| 0.9847222222222222 | 0 |
| 0.9854166666666666 | 0 |
| 0.9861111111111112 | 0 |
| 0.9868055555555556 | 0 |
| 0.9874999999999999 | 0 |
| 0.9881944444444444 | 0 |
| 0.9888888888888889 | 0 |
| 0.9895833333333334 | 0 |
| 0.9902777777777777 | 0 |
| 0.9909722222222223 | 0 |
| 0.9916666666666667 | 0 |
| 0.9923611111111111 | 0 |
| 0.9930555555555555 | 0 |
| 0.99375 | 0 |
| 0.9944444444444445 | 0 |
| 0.9951388888888889 | 0 |
| 0.9958333333333332 | 0 |
| 0.9965277777777778 | 0 |
| 0.9972222222222222 | 0 |
| 0.9979166666666667 | 0 |
| 0.998611111111111 | 0 |
| 0.9993055555555556 | 0 |